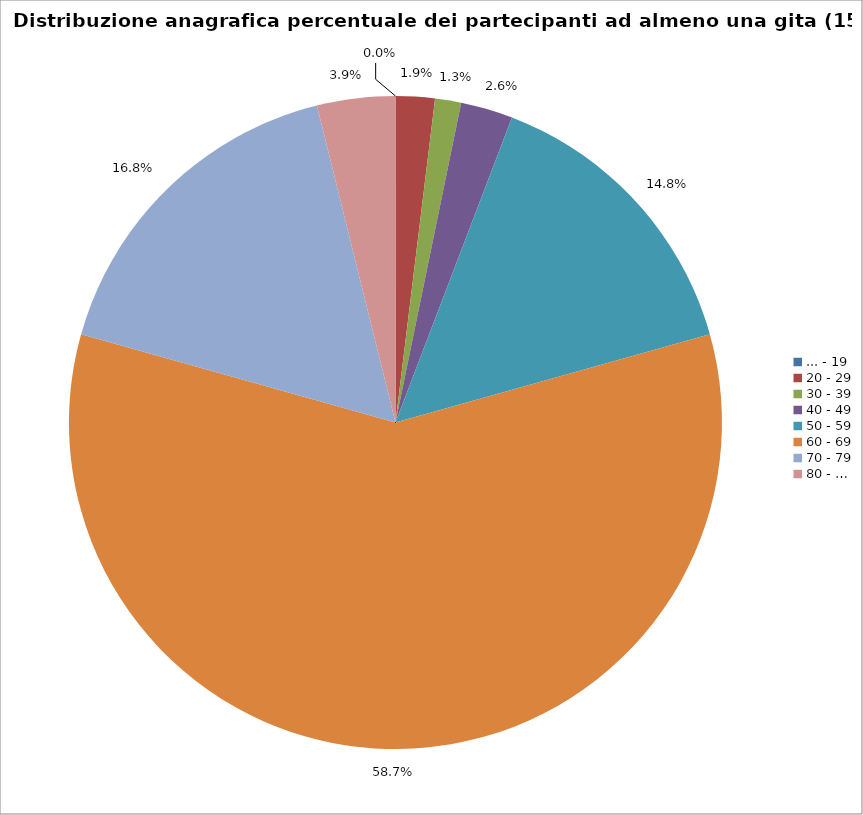
| Category | Nr. Tesserati |
|---|---|
| ... - 19 | 0 |
| 20 - 29 | 3 |
| 30 - 39 | 2 |
| 40 - 49 | 4 |
| 50 - 59 | 23 |
| 60 - 69 | 91 |
| 70 - 79 | 26 |
| 80 - … | 6 |